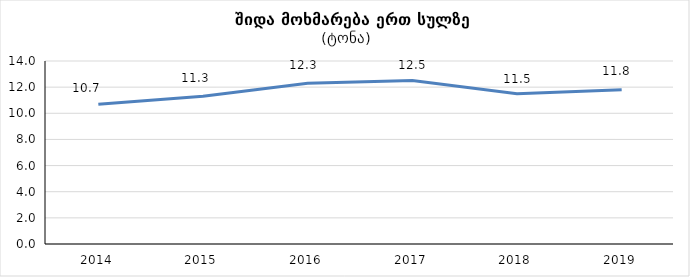
| Category | Series 0 |
|---|---|
| 2014.0 | 10.7 |
| 2015.0 | 11.3 |
| 2016.0 | 12.3 |
| 2017.0 | 12.5 |
| 2018.0 | 11.5 |
| 2019.0 | 11.8 |